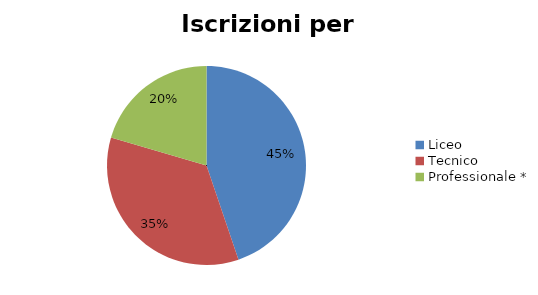
| Category | Series 0 |
|---|---|
| Liceo  | 17462 |
| Tecnico | 13543 |
| Professionale * | 7981 |